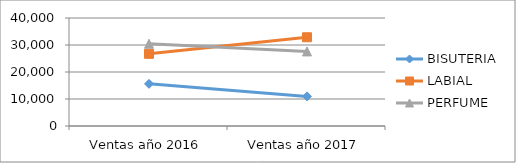
| Category | BISUTERIA | LABIAL | PERFUME |
|---|---|---|---|
| Ventas año 2016 | 15618 | 26726 | 30458 |
| Ventas año 2017 | 10968 | 32870 | 27620 |